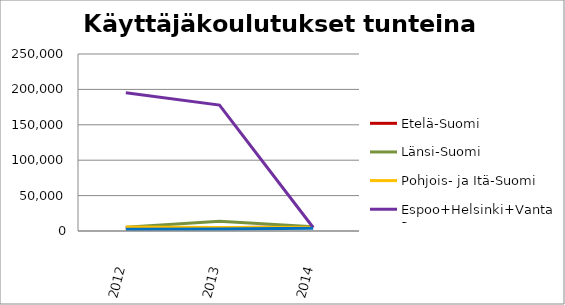
| Category | Etelä-Suomi | Länsi-Suomi | Pohjois- ja Itä-Suomi | Espoo+Helsinki+Vantaa | Muu Uusimaa |
|---|---|---|---|---|---|
| 2012.0 | 4876.07 | 5212.96 | 5701.75 | 195146.5 | 2400.5 |
| 2013.0 | 4594.75 | 13716.83 | 4955.25 | 177859.65 | 2924.7 |
| 2014.0 | 6024.95 | 5863.53 | 5183.2 | 4953 | 3894.2 |